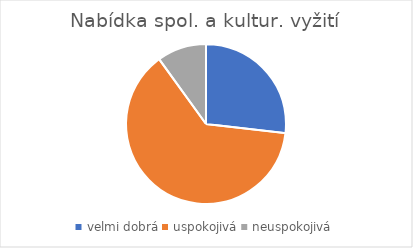
| Category | Nabídka spol. a kultur. vyžití |
|---|---|
| velmi dobrá | 70 |
| uspokojivá | 165 |
| neuspokojivá | 26 |